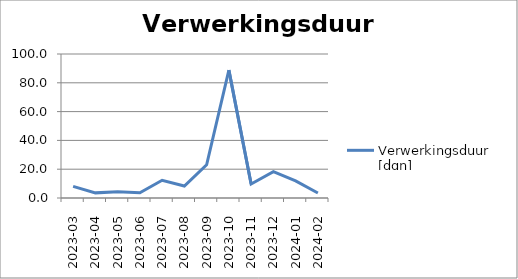
| Category | Verwerkingsduur [dgn] |
|---|---|
| 2023-03 | 8.063 |
| 2023-04 | 3.563 |
| 2023-05 | 4.389 |
| 2023-06 | 3.596 |
| 2023-07 | 12.301 |
| 2023-08 | 8.327 |
| 2023-09 | 23.106 |
| 2023-10 | 88.789 |
| 2023-11 | 9.721 |
| 2023-12 | 18.274 |
| 2024-01 | 11.87 |
| 2024-02 | 3.488 |